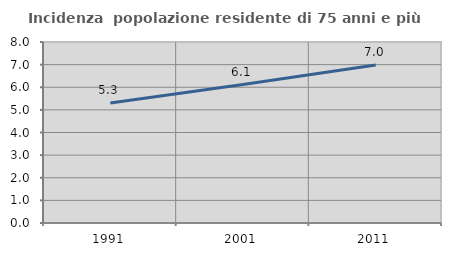
| Category | Incidenza  popolazione residente di 75 anni e più |
|---|---|
| 1991.0 | 5.299 |
| 2001.0 | 6.12 |
| 2011.0 | 6.987 |